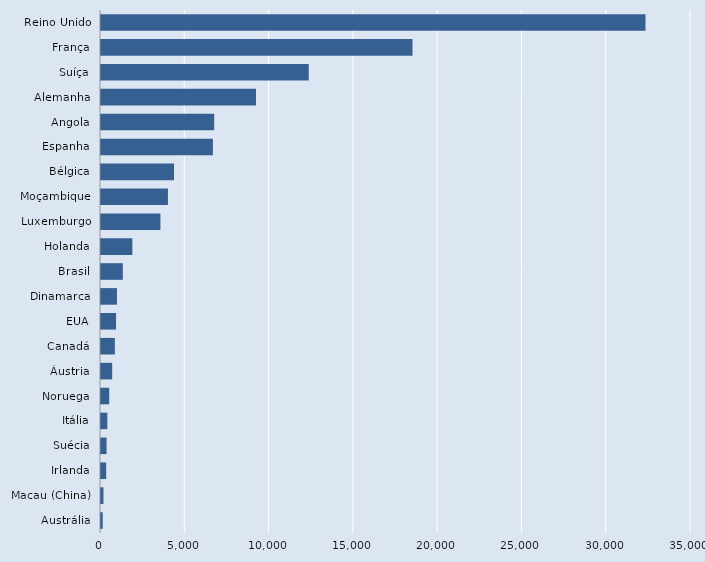
| Category | Series 0 |
|---|---|
| Austrália | 103 |
| Macau (China) | 145 |
| Irlanda | 308 |
| Suécia | 330 |
| Itália | 376 |
| Noruega | 488 |
| Áustria | 663 |
| Canadá | 822 |
| EUA | 892 |
| Dinamarca | 947 |
| Brasil | 1294 |
| Holanda | 1860 |
| Luxemburgo | 3525 |
| Moçambique | 3971 |
| Bélgica | 4332 |
| Espanha | 6638 |
| Angola | 6715 |
| Alemanha | 9195 |
| Suíça | 12325 |
| França | 18480 |
| Reino Unido | 32301 |